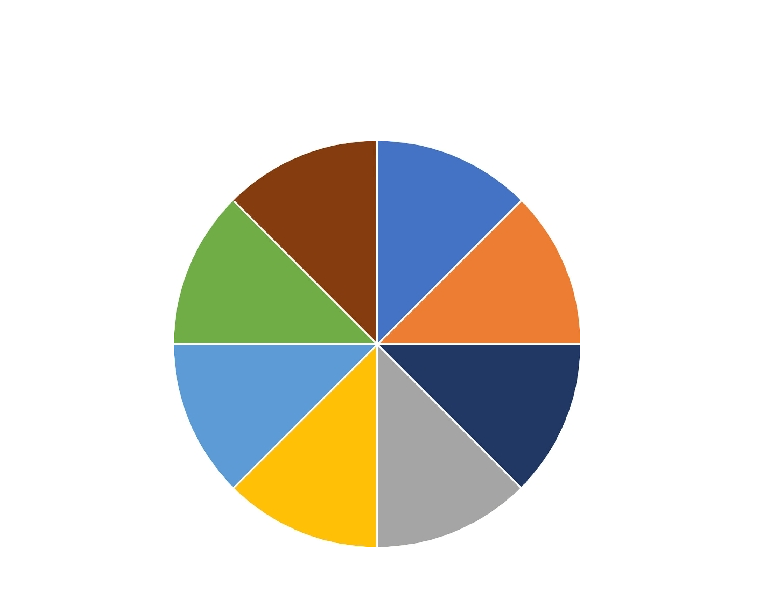
| Category | Slice Value |
|---|---|
| a | 1 |
| b | 1 |
| c | 1 |
| d | 1 |
| e | 1 |
| f | 1 |
| g | 1 |
| h | 1 |